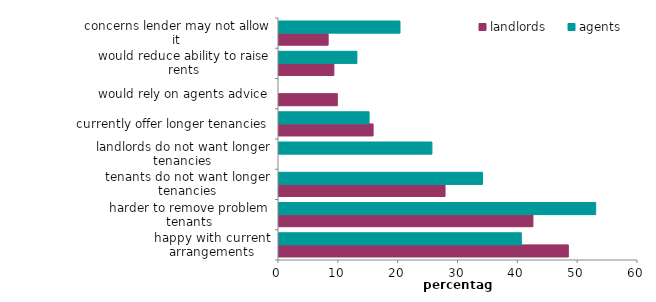
| Category | landlords | agents |
|---|---|---|
| happy with current arrangements | 48.358 | 40.501 |
| harder to remove problem tenants | 42.439 | 52.929 |
| tenants do not want longer tenancies | 27.751 | 34.006 |
| landlords do not want longer tenancies | 0 | 25.556 |
| currently offer longer tenancies | 15.728 | 15.06 |
| would rely on agents advice | 9.75 | 0 |
| would reduce ability to raise rents | 9.173 | 13.018 |
| concerns lender may not allow it | 8.214 | 20.222 |